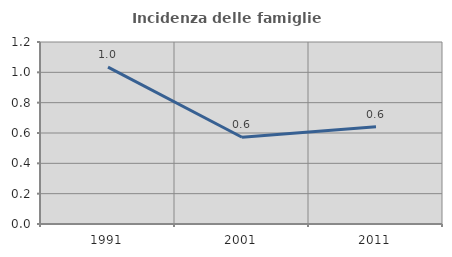
| Category | Incidenza delle famiglie numerose |
|---|---|
| 1991.0 | 1.034 |
| 2001.0 | 0.572 |
| 2011.0 | 0.641 |